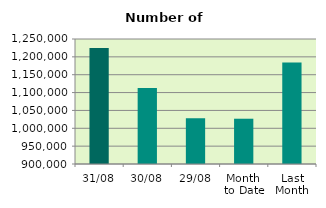
| Category | Series 0 |
|---|---|
| 31/08 | 1225074 |
| 30/08 | 1112966 |
| 29/08 | 1027916 |
| Month 
to Date | 1026775.304 |
| Last
Month | 1183989.81 |